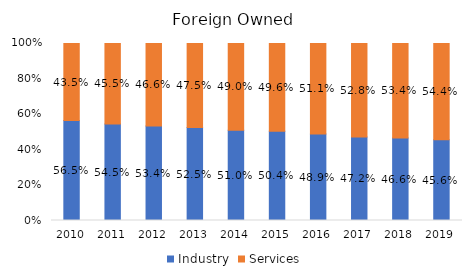
| Category | Industry | Services |
|---|---|---|
| 2010.0 | 0.565 | 0.435 |
| 2011.0 | 0.545 | 0.455 |
| 2012.0 | 0.534 | 0.466 |
| 2013.0 | 0.525 | 0.475 |
| 2014.0 | 0.51 | 0.49 |
| 2015.0 | 0.504 | 0.496 |
| 2016.0 | 0.489 | 0.511 |
| 2017.0 | 0.472 | 0.528 |
| 2018.0 | 0.466 | 0.534 |
| 2019.0 | 0.456 | 0.544 |